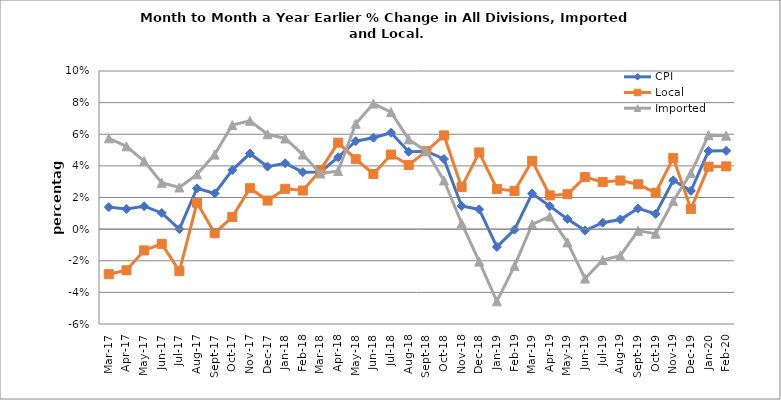
| Category | CPI | Local | Imported |
|---|---|---|---|
| 2017-03-01 | 0.014 | -0.029 | 0.057 |
| 2017-04-01 | 0.013 | -0.026 | 0.052 |
| 2017-05-01 | 0.015 | -0.013 | 0.043 |
| 2017-06-01 | 0.01 | -0.009 | 0.029 |
| 2017-07-01 | 0 | -0.027 | 0.026 |
| 2017-08-01 | 0.026 | 0.017 | 0.035 |
| 2017-09-01 | 0.023 | -0.003 | 0.047 |
| 2017-10-01 | 0.037 | 0.008 | 0.066 |
| 2017-11-01 | 0.048 | 0.026 | 0.069 |
| 2017-12-01 | 0.04 | 0.018 | 0.06 |
| 2018-01-01 | 0.042 | 0.025 | 0.057 |
| 2018-02-01 | 0.036 | 0.024 | 0.047 |
| 2018-03-01 | 0.036 | 0.037 | 0.035 |
| 2018-04-01 | 0.045 | 0.055 | 0.037 |
| 2018-05-01 | 0.056 | 0.044 | 0.067 |
| 2018-06-01 | 0.058 | 0.035 | 0.079 |
| 2018-07-01 | 0.061 | 0.047 | 0.074 |
| 2018-08-01 | 0.049 | 0.041 | 0.057 |
| 2018-09-01 | 0.049 | 0.049 | 0.049 |
| 2018-10-01 | 0.044 | 0.059 | 0.031 |
| 2018-11-01 | 0.015 | 0.027 | 0.004 |
| 2018-12-01 | 0.012 | 0.049 | -0.021 |
| 2019-01-01 | -0.011 | 0.025 | -0.046 |
| 2019-02-01 | 0 | 0.024 | -0.023 |
| 2019-03-01 | 0.023 | 0.043 | 0.003 |
| 2019-04-01 | 0.015 | 0.021 | 0.008 |
| 2019-05-01 | 0.006 | 0.022 | -0.008 |
| 2019-06-01 | -0.001 | 0.033 | -0.031 |
| 2019-07-01 | 0.004 | 0.03 | -0.02 |
| 2019-08-01 | 0.006 | 0.031 | -0.017 |
| 2019-09-01 | 0.013 | 0.028 | -0.001 |
| 2019-10-01 | 0.01 | 0.023 | -0.003 |
| 2019-11-01 | 0.031 | 0.045 | 0.018 |
| 2019-12-01 | 0.024 | 0.013 | 0.035 |
| 2020-01-01 | 0.049 | 0.039 | 0.059 |
| 2020-02-01 | 0.05 | 0.04 | 0.059 |